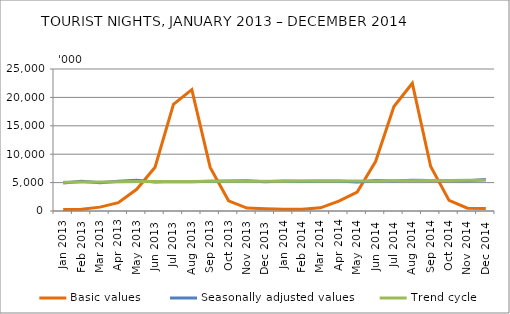
| Category | Basic values | Seasonally adjusted values | Trend cycle |
|---|---|---|---|
| Jan 2013 | 277 | 4929 | 5061 |
| Feb 2013 | 311 | 5231 | 5093 |
| Mar 2013 | 681 | 4986 | 5125 |
| Apr 2013 | 1465 | 5223 | 5160 |
| May 2013 | 3820 | 5433 | 5185 |
| Jun 2013 | 7717 | 5100 | 5192 |
| Jul 2013 | 18792 | 5201 | 5197 |
| Aug 2013 | 21377 | 5134 | 5207 |
| Sep 2013 | 7683 | 5221 | 5223 |
| Oct 2013 | 1799 | 5295 | 5240 |
| Nov 2013 | 508 | 5346 | 5249 |
| Dec 2013 | 387 | 5157 | 5251 |
| Jan 2014 | 312 | 5294 | 5256 |
| Feb 2014 | 320 | 5246 | 5262 |
| Mar 2014 | 556 | 5289 | 5267 |
| Apr 2014 | 1738 | 5262 | 5271 |
| May 2014 | 3320 | 5119 | 5281 |
| Jun 2014 | 8708 | 5375 | 5302 |
| Jul 2014 | 18402 | 5300 | 5326 |
| Aug 2014 | 22499 | 5403 | 5346 |
| Sep 2014 | 7840 | 5348 | 5363 |
| Oct 2014 | 1876 | 5353 | 5380 |
| Nov 2014 | 488 | 5334 | 5402 |
| Dec 2014 | 425 | 5530 | 5427 |